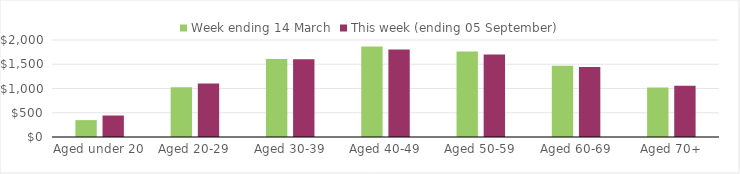
| Category | Week ending 14 March | This week (ending 05 September) |
|---|---|---|
| Aged under 20 | 347.82 | 442.95 |
| Aged 20-29 | 1026.01 | 1101.96 |
| Aged 30-39 | 1608.25 | 1604.75 |
| Aged 40-49 | 1865.41 | 1803.28 |
| Aged 50-59 | 1762.75 | 1701.38 |
| Aged 60-69 | 1469.56 | 1442.38 |
| Aged 70+ | 1020.01 | 1059.05 |